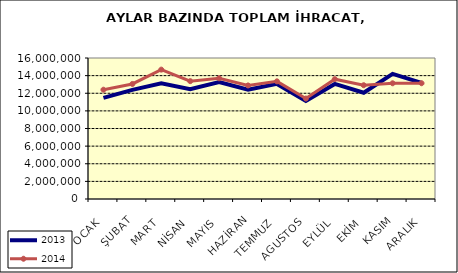
| Category | 2013 | 2014 |
|---|---|---|
| OCAK | 11481521.079 | 12401039.861 |
| ŞUBAT | 12385690.909 | 13054023.337 |
| MART | 13122058.141 | 14681761.442 |
| NİSAN | 12468202.903 | 13373287.076 |
| MAYIS | 13277209.017 | 13699161.366 |
| HAZİRAN | 12399973.962 | 12885863.393 |
| TEMMUZ | 13059519.685 | 13350844.19 |
| AGUSTOS | 11118300.903 | 11399550.571 |
| EYLÜL | 13060371.039 | 13597288.942 |
| EKİM | 12053704.638 | 12910949.214 |
| KASIM | 14201227.351 | 13131524.414 |
| ARALIK | 13174857.46 | 13136763.38 |